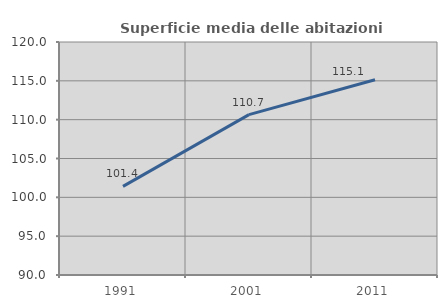
| Category | Superficie media delle abitazioni occupate |
|---|---|
| 1991.0 | 101.406 |
| 2001.0 | 110.654 |
| 2011.0 | 115.137 |